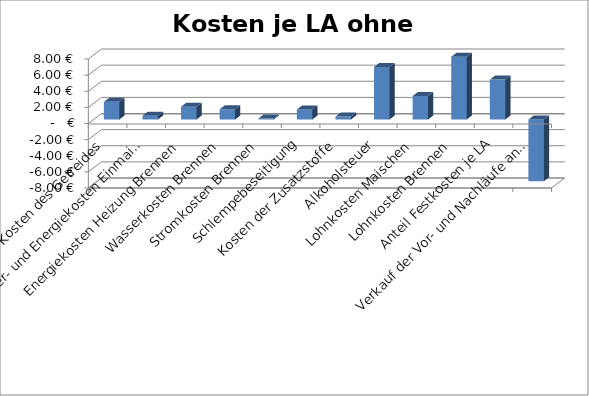
| Category | Kosten je LA ohne Vermarktung |
|---|---|
| Kosten des Getreides | 2.188 |
| Wasser- und Energiekosten Einmaischen | 0.47 |
| Energiekosten Heizung Brennen | 1.587 |
| Wasserkosten Brennen | 1.27 |
| Stromkosten Brennen | 0.117 |
| Schlempebeseitigung | 1.245 |
| Kosten der Zusatzstoffe | 0.358 |
| Alkoholsteuer | 6.513 |
| Lohnkosten Maischen | 2.918 |
| Lohnkosten Brennen | 7.781 |
| Anteil Festkosten je LA | 4.949 |
| Verkauf der Vor- und Nachläufe an Händler pro LA | -7.653 |